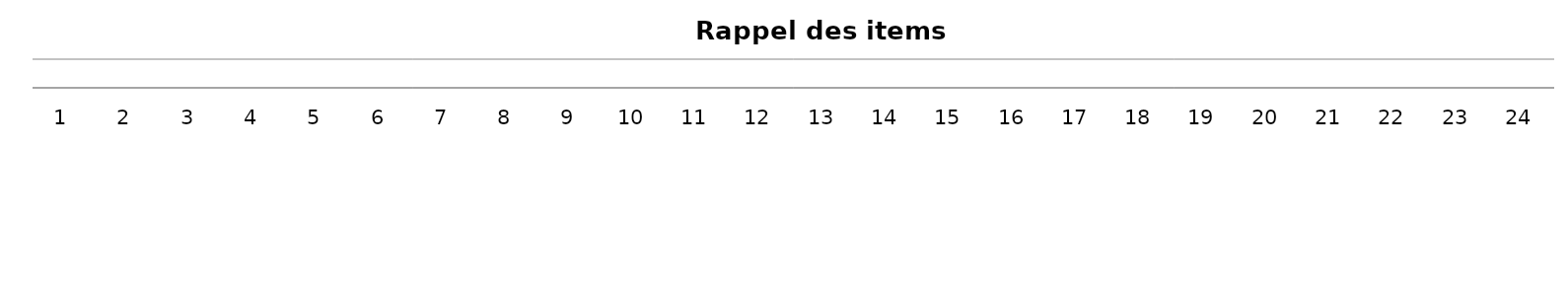
| Category | Series 0 |
|---|---|
| 1.0 | 0 |
| 2.0 | 0 |
| 3.0 | 0 |
| 4.0 | 0 |
| 5.0 | 0 |
| 6.0 | 0 |
| 7.0 | 0 |
| 8.0 | 0 |
| 9.0 | 0 |
| 10.0 | 0 |
| 11.0 | 0 |
| 12.0 | 0 |
| 13.0 | 0 |
| 14.0 | 0 |
| 15.0 | 0 |
| 16.0 | 0 |
| 17.0 | 0 |
| 18.0 | 0 |
| 19.0 | 0 |
| 20.0 | 0 |
| 21.0 | 0 |
| 22.0 | 0 |
| 23.0 | 0 |
| 24.0 | 0 |